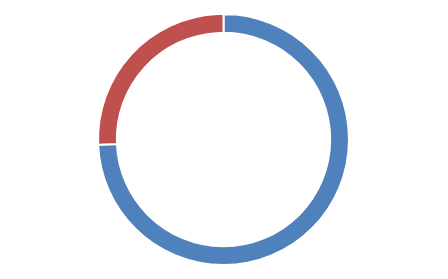
| Category | Series 0 |
|---|---|
| 0 | 55 |
| 1 | 19 |